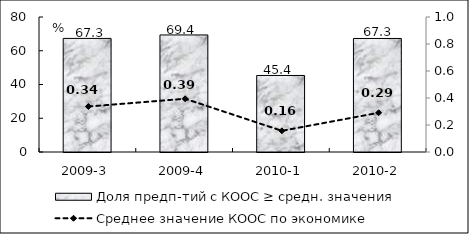
| Category | Доля предп-тий с КООС ≥ средн. значения  |
|---|---|
| 2009-3 | 67.31 |
| 2009-4 | 69.37 |
| 2010-1 | 45.35 |
| 2010-2 | 67.27 |